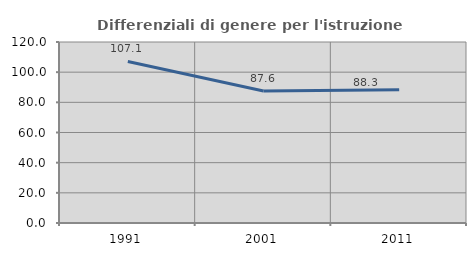
| Category | Differenziali di genere per l'istruzione superiore |
|---|---|
| 1991.0 | 107.097 |
| 2001.0 | 87.573 |
| 2011.0 | 88.261 |